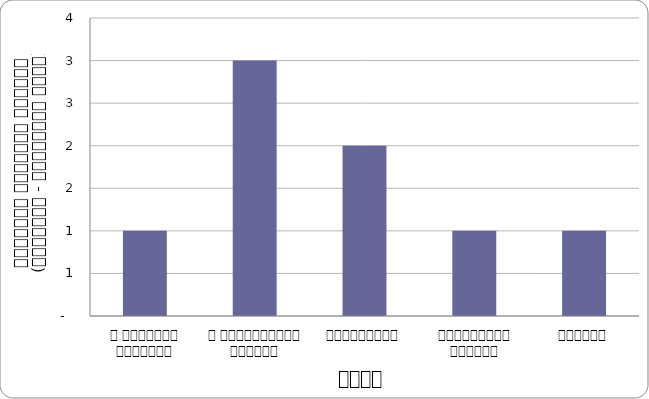
| Category | शासन |
|---|---|
| द हिमालयन टाइम्स् | 1 |
| द काठमाण्डौं पोस्ट् | 3 |
| कान्तिपुर | 2 |
| अन्नपूर्ण पोस्ट् | 1 |
| नागरिक | 1 |